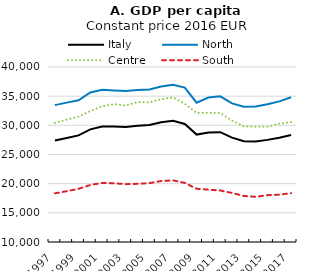
| Category | Italy | North | Centre | South |
|---|---|---|---|---|
| 1997.0 | 27407.962 | 33466.35 | 30423.46 | 18344.545 |
| 1998.0 | 27842.77 | 33890.888 | 30986.064 | 18711.942 |
| 1999.0 | 28272.306 | 34292.798 | 31481.438 | 19114.384 |
| 2000.0 | 29308.005 | 35623.002 | 32450.8 | 19774.674 |
| 2001.0 | 29807.715 | 36084.779 | 33244.007 | 20134.802 |
| 2002.0 | 29819.159 | 35961.146 | 33643.47 | 20071.313 |
| 2003.0 | 29701.417 | 35881.296 | 33382.45 | 19915.641 |
| 2004.0 | 29945.844 | 36046.816 | 33993.689 | 19974.814 |
| 2005.0 | 30050.585 | 36155.763 | 33939.572 | 20094.704 |
| 2006.0 | 30528.817 | 36654.011 | 34474.103 | 20455.535 |
| 2007.0 | 30789.593 | 36966.099 | 34777.482 | 20562.355 |
| 2008.0 | 30232.443 | 36482.143 | 33698.759 | 20126.332 |
| 2009.0 | 28413.739 | 33884.157 | 32130.606 | 19127.352 |
| 2010.0 | 28771.586 | 34764.049 | 32137.084 | 18976.753 |
| 2011.0 | 28826.481 | 34976.453 | 32119.335 | 18826.779 |
| 2012.0 | 27884.278 | 33756.007 | 30825.326 | 18406.018 |
| 2013.0 | 27263.544 | 33186.508 | 29826.057 | 17887.313 |
| 2014.0 | 27230.467 | 33239.693 | 29752.652 | 17742.312 |
| 2015.0 | 27508.548 | 33613.645 | 29773.505 | 18031.057 |
| 2016.0 | 27870.976 | 34101.059 | 30266.865 | 18118.331 |
| 2017.0 | 28351.502 | 34817.354 | 30553.688 | 18365.516 |